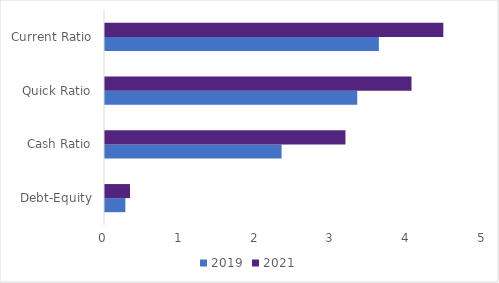
| Category | 2019 | 2021 |
|---|---|---|
| Debt-Equity | 0.268 | 0.33 |
| Cash Ratio | 2.329 | 3.172 |
| Quick Ratio | 3.328 | 4.044 |
| Current Ratio | 3.613 | 4.463 |